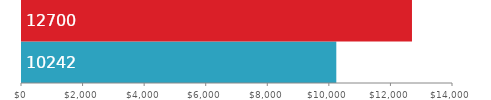
| Category | Annual Totals |
|---|---|
| Expenditures | 10242 |
| Income | 12700 |